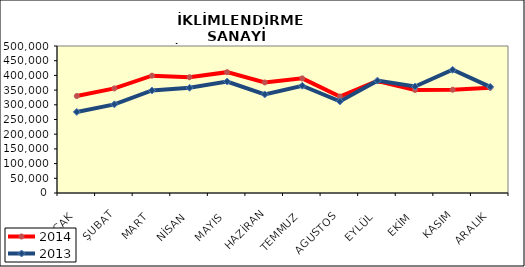
| Category | 2014 | 2013 |
|---|---|---|
| OCAK | 329794.639 | 275661.769 |
| ŞUBAT | 355763.905 | 301532.522 |
| MART | 399128.708 | 348675.753 |
| NİSAN | 393758.543 | 357872.46 |
| MAYIS | 411021.459 | 379190.421 |
| HAZİRAN | 376023.25 | 335219.637 |
| TEMMUZ | 389898.46 | 364870.491 |
| AGUSTOS | 328196.933 | 311599.059 |
| EYLÜL | 381085.54 | 382215.221 |
| EKİM | 350587.343 | 362202.207 |
| KASIM | 351354.434 | 419098.26 |
| ARALIK | 357912.504 | 361065.048 |